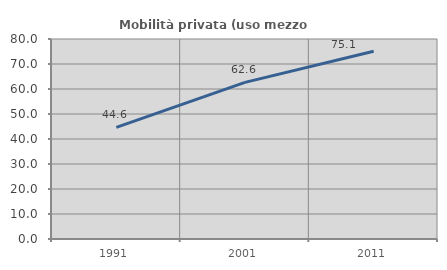
| Category | Mobilità privata (uso mezzo privato) |
|---|---|
| 1991.0 | 44.634 |
| 2001.0 | 62.644 |
| 2011.0 | 75.133 |